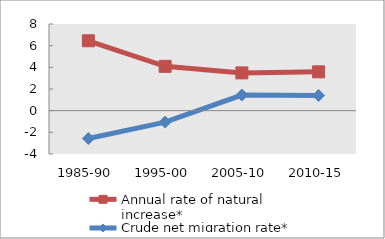
| Category | Annual rate of natural increase* | Crude net migration rate* |
|---|---|---|
| 1985-90 | 6.451 | -2.572 |
| 1995-00 | 4.091 | -1.055 |
| 2005-10 | 3.488 | 1.443 |
| 2010-15 | 3.584 | 1.407 |